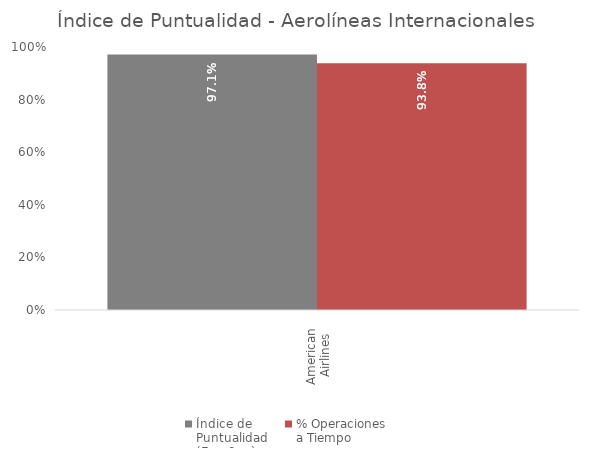
| Category | Índice de 
Puntualidad
(Ene-Sep) | % Operaciones 
a Tiempo |
|---|---|---|
| American 
Airlines | 0.971 | 0.938 |